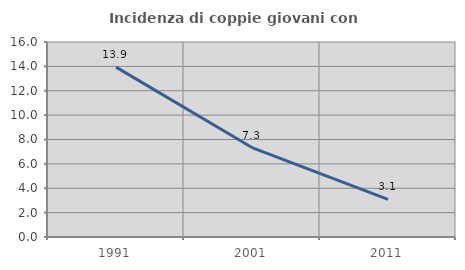
| Category | Incidenza di coppie giovani con figli |
|---|---|
| 1991.0 | 13.937 |
| 2001.0 | 7.34 |
| 2011.0 | 3.085 |